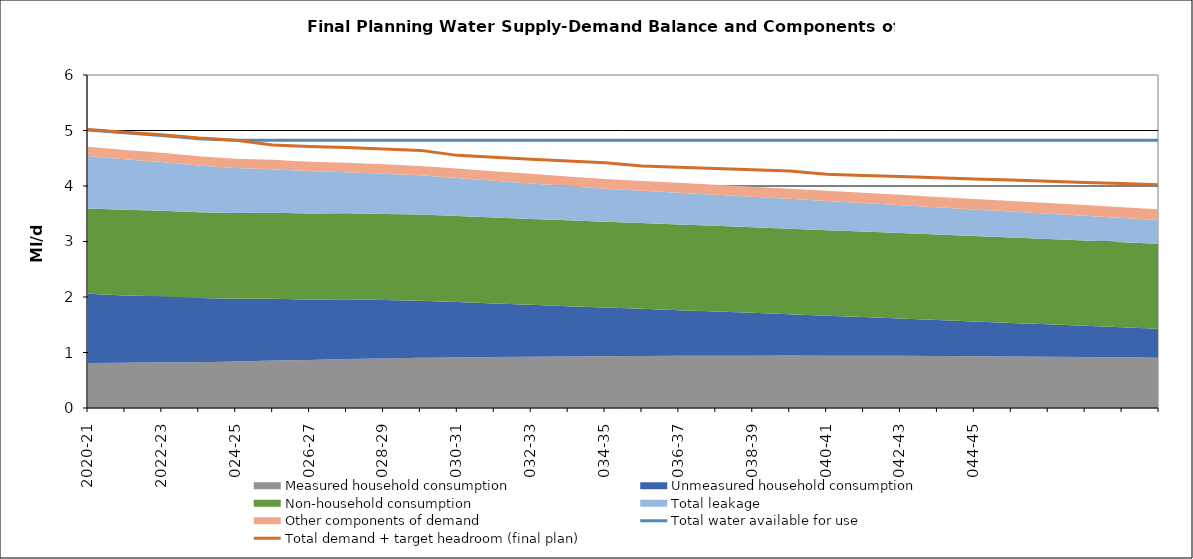
| Category | Total water available for use | Total demand + target headroom (final plan) |
|---|---|---|
| 0 | 5.011 | 5.017 |
| 1 | 4.961 | 4.967 |
| 2 | 4.911 | 4.923 |
| 3 | 4.854 | 4.865 |
| 4 | 4.823 | 4.824 |
| 5 | 4.823 | 4.741 |
| 6 | 4.823 | 4.712 |
| 7 | 4.823 | 4.694 |
| 8 | 4.823 | 4.667 |
| 9 | 4.823 | 4.642 |
| 10 | 4.823 | 4.552 |
| 11 | 4.823 | 4.516 |
| 12 | 4.823 | 4.484 |
| 13 | 4.823 | 4.449 |
| 14 | 4.823 | 4.417 |
| 15 | 4.823 | 4.358 |
| 16 | 4.823 | 4.337 |
| 17 | 4.823 | 4.315 |
| 18 | 4.823 | 4.293 |
| 19 | 4.823 | 4.27 |
| 20 | 4.823 | 4.211 |
| 21 | 4.823 | 4.19 |
| 22 | 4.823 | 4.172 |
| 23 | 4.823 | 4.148 |
| 24 | 4.823 | 4.128 |
| 25 | 4.823 | 4.106 |
| 26 | 4.823 | 4.086 |
| 27 | 4.823 | 4.062 |
| 28 | 4.823 | 4.043 |
| 29 | 4.823 | 4.023 |